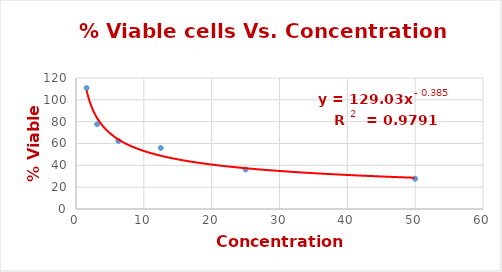
| Category | Series 0 |
|---|---|
| 50.0 | 27.66 |
| 25.0 | 36.17 |
| 12.5 | 55.957 |
| 6.25 | 62.34 |
| 3.125 | 77.66 |
| 1.5625 | 110.851 |